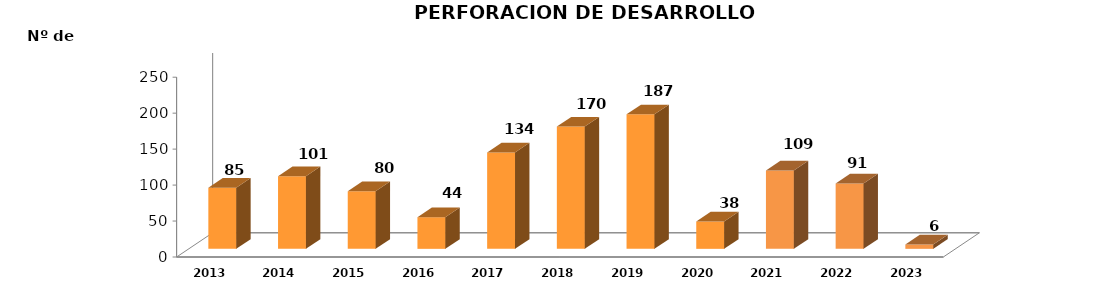
| Category | Series 0 |
|---|---|
| 2013.0 | 85 |
| 2014.0 | 101 |
| 2015.0 | 80 |
| 2016.0 | 44 |
| 2017.0 | 134 |
| 2018.0 | 170 |
| 2019.0 | 187 |
| 2020.0 | 38 |
| 2021.0 | 109 |
| 2022.0 | 91 |
| 2023.0 | 6 |